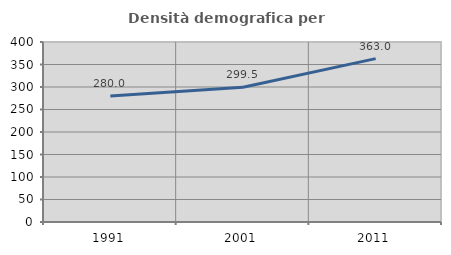
| Category | Densità demografica |
|---|---|
| 1991.0 | 280.048 |
| 2001.0 | 299.523 |
| 2011.0 | 363.005 |